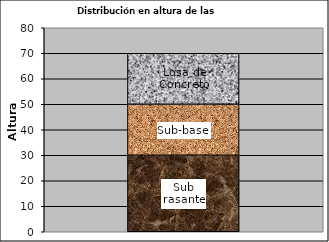
| Category | Sub rasante | Sub-base | Hormigón |
|---|---|---|---|
| 0 | 30 | 20 | 20 |